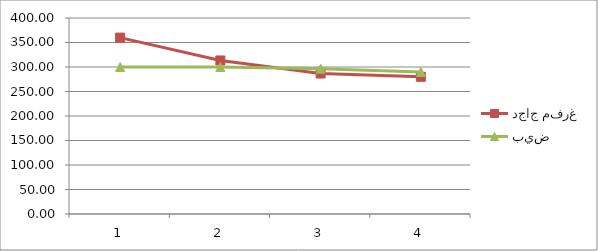
| Category | دجاج مفرغ | بيض |
|---|---|---|
| 0 | 360 | 300 |
| 1 | 313.33 | 300 |
| 2 | 286.67 | 296.67 |
| 3 | 280 | 290 |